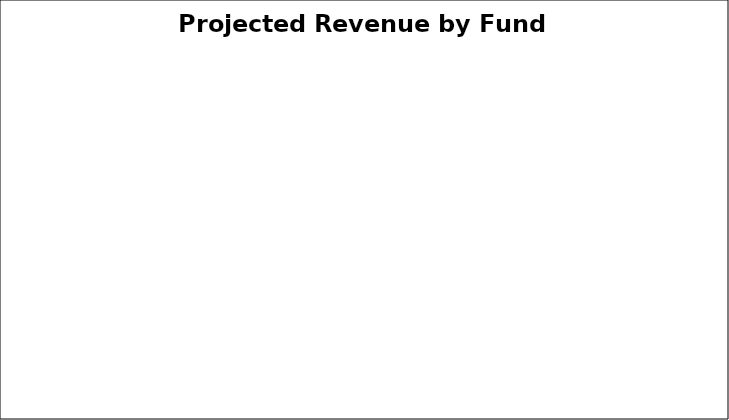
| Category | Series 0 |
|---|---|
| LCFF supplemental & concentration grants | 0 |
| All Other LCFF funds | 0 |
| All other state funds | 0 |
| All local funds | 0 |
| All federal funds | 0 |